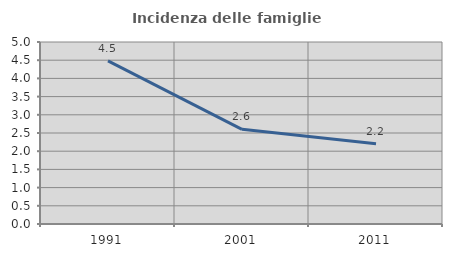
| Category | Incidenza delle famiglie numerose |
|---|---|
| 1991.0 | 4.482 |
| 2001.0 | 2.602 |
| 2011.0 | 2.205 |